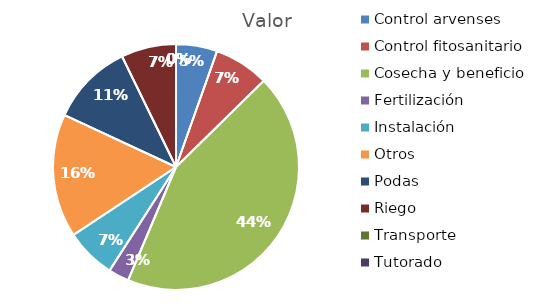
| Category | Valor |
|---|---|
| Control arvenses | 4523040 |
| Control fitosanitario | 6030720 |
| Cosecha y beneficio | 36500000 |
| Fertilización | 2261520 |
| Instalación | 5518836 |
| Otros | 13569120 |
| Podas | 9046080 |
| Riego | 6030720 |
| Transporte | 0 |
| Tutorado | 0 |